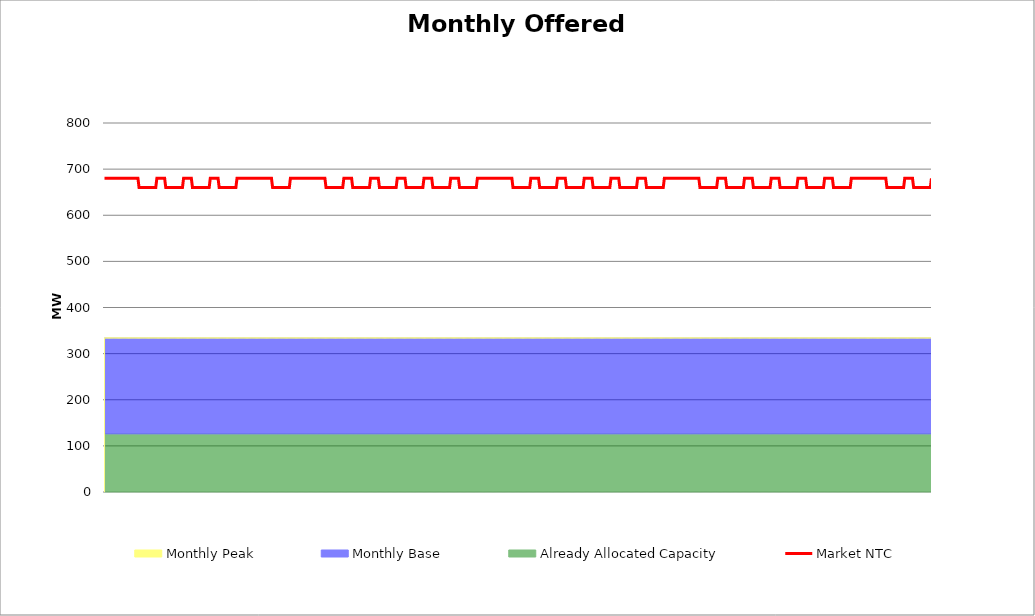
| Category | Market NTC |
|---|---|
| 0 | 680 |
| 1 | 680 |
| 2 | 680 |
| 3 | 680 |
| 4 | 680 |
| 5 | 680 |
| 6 | 680 |
| 7 | 680 |
| 8 | 680 |
| 9 | 680 |
| 10 | 680 |
| 11 | 680 |
| 12 | 680 |
| 13 | 680 |
| 14 | 680 |
| 15 | 680 |
| 16 | 680 |
| 17 | 680 |
| 18 | 680 |
| 19 | 680 |
| 20 | 680 |
| 21 | 680 |
| 22 | 680 |
| 23 | 680 |
| 24 | 680 |
| 25 | 680 |
| 26 | 680 |
| 27 | 680 |
| 28 | 680 |
| 29 | 680 |
| 30 | 680 |
| 31 | 660 |
| 32 | 660 |
| 33 | 660 |
| 34 | 660 |
| 35 | 660 |
| 36 | 660 |
| 37 | 660 |
| 38 | 660 |
| 39 | 660 |
| 40 | 660 |
| 41 | 660 |
| 42 | 660 |
| 43 | 660 |
| 44 | 660 |
| 45 | 660 |
| 46 | 660 |
| 47 | 680 |
| 48 | 680 |
| 49 | 680 |
| 50 | 680 |
| 51 | 680 |
| 52 | 680 |
| 53 | 680 |
| 54 | 680 |
| 55 | 660 |
| 56 | 660 |
| 57 | 660 |
| 58 | 660 |
| 59 | 660 |
| 60 | 660 |
| 61 | 660 |
| 62 | 660 |
| 63 | 660 |
| 64 | 660 |
| 65 | 660 |
| 66 | 660 |
| 67 | 660 |
| 68 | 660 |
| 69 | 660 |
| 70 | 660 |
| 71 | 680 |
| 72 | 680 |
| 73 | 680 |
| 74 | 680 |
| 75 | 680 |
| 76 | 680 |
| 77 | 680 |
| 78 | 680 |
| 79 | 660 |
| 80 | 660 |
| 81 | 660 |
| 82 | 660 |
| 83 | 660 |
| 84 | 660 |
| 85 | 660 |
| 86 | 660 |
| 87 | 660 |
| 88 | 660 |
| 89 | 660 |
| 90 | 660 |
| 91 | 660 |
| 92 | 660 |
| 93 | 660 |
| 94 | 660 |
| 95 | 680 |
| 96 | 680 |
| 97 | 680 |
| 98 | 680 |
| 99 | 680 |
| 100 | 680 |
| 101 | 680 |
| 102 | 680 |
| 103 | 660 |
| 104 | 660 |
| 105 | 660 |
| 106 | 660 |
| 107 | 660 |
| 108 | 660 |
| 109 | 660 |
| 110 | 660 |
| 111 | 660 |
| 112 | 660 |
| 113 | 660 |
| 114 | 660 |
| 115 | 660 |
| 116 | 660 |
| 117 | 660 |
| 118 | 660 |
| 119 | 680 |
| 120 | 680 |
| 121 | 680 |
| 122 | 680 |
| 123 | 680 |
| 124 | 680 |
| 125 | 680 |
| 126 | 680 |
| 127 | 680 |
| 128 | 680 |
| 129 | 680 |
| 130 | 680 |
| 131 | 680 |
| 132 | 680 |
| 133 | 680 |
| 134 | 680 |
| 135 | 680 |
| 136 | 680 |
| 137 | 680 |
| 138 | 680 |
| 139 | 680 |
| 140 | 680 |
| 141 | 680 |
| 142 | 680 |
| 143 | 680 |
| 144 | 680 |
| 145 | 680 |
| 146 | 680 |
| 147 | 680 |
| 148 | 680 |
| 149 | 680 |
| 150 | 680 |
| 151 | 660 |
| 152 | 660 |
| 153 | 660 |
| 154 | 660 |
| 155 | 660 |
| 156 | 660 |
| 157 | 660 |
| 158 | 660 |
| 159 | 660 |
| 160 | 660 |
| 161 | 660 |
| 162 | 660 |
| 163 | 660 |
| 164 | 660 |
| 165 | 660 |
| 166 | 660 |
| 167 | 680 |
| 168 | 680 |
| 169 | 680 |
| 170 | 680 |
| 171 | 680 |
| 172 | 680 |
| 173 | 680 |
| 174 | 680 |
| 175 | 680 |
| 176 | 680 |
| 177 | 680 |
| 178 | 680 |
| 179 | 680 |
| 180 | 680 |
| 181 | 680 |
| 182 | 680 |
| 183 | 680 |
| 184 | 680 |
| 185 | 680 |
| 186 | 680 |
| 187 | 680 |
| 188 | 680 |
| 189 | 680 |
| 190 | 680 |
| 191 | 680 |
| 192 | 680 |
| 193 | 680 |
| 194 | 680 |
| 195 | 680 |
| 196 | 680 |
| 197 | 680 |
| 198 | 680 |
| 199 | 660 |
| 200 | 660 |
| 201 | 660 |
| 202 | 660 |
| 203 | 660 |
| 204 | 660 |
| 205 | 660 |
| 206 | 660 |
| 207 | 660 |
| 208 | 660 |
| 209 | 660 |
| 210 | 660 |
| 211 | 660 |
| 212 | 660 |
| 213 | 660 |
| 214 | 660 |
| 215 | 680 |
| 216 | 680 |
| 217 | 680 |
| 218 | 680 |
| 219 | 680 |
| 220 | 680 |
| 221 | 680 |
| 222 | 680 |
| 223 | 660 |
| 224 | 660 |
| 225 | 660 |
| 226 | 660 |
| 227 | 660 |
| 228 | 660 |
| 229 | 660 |
| 230 | 660 |
| 231 | 660 |
| 232 | 660 |
| 233 | 660 |
| 234 | 660 |
| 235 | 660 |
| 236 | 660 |
| 237 | 660 |
| 238 | 660 |
| 239 | 680 |
| 240 | 680 |
| 241 | 680 |
| 242 | 680 |
| 243 | 680 |
| 244 | 680 |
| 245 | 680 |
| 246 | 680 |
| 247 | 660 |
| 248 | 660 |
| 249 | 660 |
| 250 | 660 |
| 251 | 660 |
| 252 | 660 |
| 253 | 660 |
| 254 | 660 |
| 255 | 660 |
| 256 | 660 |
| 257 | 660 |
| 258 | 660 |
| 259 | 660 |
| 260 | 660 |
| 261 | 660 |
| 262 | 660 |
| 263 | 680 |
| 264 | 680 |
| 265 | 680 |
| 266 | 680 |
| 267 | 680 |
| 268 | 680 |
| 269 | 680 |
| 270 | 680 |
| 271 | 660 |
| 272 | 660 |
| 273 | 660 |
| 274 | 660 |
| 275 | 660 |
| 276 | 660 |
| 277 | 660 |
| 278 | 660 |
| 279 | 660 |
| 280 | 660 |
| 281 | 660 |
| 282 | 660 |
| 283 | 660 |
| 284 | 660 |
| 285 | 660 |
| 286 | 660 |
| 287 | 680 |
| 288 | 680 |
| 289 | 680 |
| 290 | 680 |
| 291 | 680 |
| 292 | 680 |
| 293 | 680 |
| 294 | 680 |
| 295 | 660 |
| 296 | 660 |
| 297 | 660 |
| 298 | 660 |
| 299 | 660 |
| 300 | 660 |
| 301 | 660 |
| 302 | 660 |
| 303 | 660 |
| 304 | 660 |
| 305 | 660 |
| 306 | 660 |
| 307 | 660 |
| 308 | 660 |
| 309 | 660 |
| 310 | 660 |
| 311 | 680 |
| 312 | 680 |
| 313 | 680 |
| 314 | 680 |
| 315 | 680 |
| 316 | 680 |
| 317 | 680 |
| 318 | 680 |
| 319 | 660 |
| 320 | 660 |
| 321 | 660 |
| 322 | 660 |
| 323 | 660 |
| 324 | 660 |
| 325 | 660 |
| 326 | 660 |
| 327 | 660 |
| 328 | 660 |
| 329 | 660 |
| 330 | 660 |
| 331 | 660 |
| 332 | 660 |
| 333 | 660 |
| 334 | 660 |
| 335 | 680 |
| 336 | 680 |
| 337 | 680 |
| 338 | 680 |
| 339 | 680 |
| 340 | 680 |
| 341 | 680 |
| 342 | 680 |
| 343 | 680 |
| 344 | 680 |
| 345 | 680 |
| 346 | 680 |
| 347 | 680 |
| 348 | 680 |
| 349 | 680 |
| 350 | 680 |
| 351 | 680 |
| 352 | 680 |
| 353 | 680 |
| 354 | 680 |
| 355 | 680 |
| 356 | 680 |
| 357 | 680 |
| 358 | 680 |
| 359 | 680 |
| 360 | 680 |
| 361 | 680 |
| 362 | 680 |
| 363 | 680 |
| 364 | 680 |
| 365 | 680 |
| 366 | 680 |
| 367 | 660 |
| 368 | 660 |
| 369 | 660 |
| 370 | 660 |
| 371 | 660 |
| 372 | 660 |
| 373 | 660 |
| 374 | 660 |
| 375 | 660 |
| 376 | 660 |
| 377 | 660 |
| 378 | 660 |
| 379 | 660 |
| 380 | 660 |
| 381 | 660 |
| 382 | 660 |
| 383 | 680 |
| 384 | 680 |
| 385 | 680 |
| 386 | 680 |
| 387 | 680 |
| 388 | 680 |
| 389 | 680 |
| 390 | 680 |
| 391 | 660 |
| 392 | 660 |
| 393 | 660 |
| 394 | 660 |
| 395 | 660 |
| 396 | 660 |
| 397 | 660 |
| 398 | 660 |
| 399 | 660 |
| 400 | 660 |
| 401 | 660 |
| 402 | 660 |
| 403 | 660 |
| 404 | 660 |
| 405 | 660 |
| 406 | 660 |
| 407 | 680 |
| 408 | 680 |
| 409 | 680 |
| 410 | 680 |
| 411 | 680 |
| 412 | 680 |
| 413 | 680 |
| 414 | 680 |
| 415 | 660 |
| 416 | 660 |
| 417 | 660 |
| 418 | 660 |
| 419 | 660 |
| 420 | 660 |
| 421 | 660 |
| 422 | 660 |
| 423 | 660 |
| 424 | 660 |
| 425 | 660 |
| 426 | 660 |
| 427 | 660 |
| 428 | 660 |
| 429 | 660 |
| 430 | 660 |
| 431 | 680 |
| 432 | 680 |
| 433 | 680 |
| 434 | 680 |
| 435 | 680 |
| 436 | 680 |
| 437 | 680 |
| 438 | 680 |
| 439 | 660 |
| 440 | 660 |
| 441 | 660 |
| 442 | 660 |
| 443 | 660 |
| 444 | 660 |
| 445 | 660 |
| 446 | 660 |
| 447 | 660 |
| 448 | 660 |
| 449 | 660 |
| 450 | 660 |
| 451 | 660 |
| 452 | 660 |
| 453 | 660 |
| 454 | 660 |
| 455 | 680 |
| 456 | 680 |
| 457 | 680 |
| 458 | 680 |
| 459 | 680 |
| 460 | 680 |
| 461 | 680 |
| 462 | 680 |
| 463 | 660 |
| 464 | 660 |
| 465 | 660 |
| 466 | 660 |
| 467 | 660 |
| 468 | 660 |
| 469 | 660 |
| 470 | 660 |
| 471 | 660 |
| 472 | 660 |
| 473 | 660 |
| 474 | 660 |
| 475 | 660 |
| 476 | 660 |
| 477 | 660 |
| 478 | 660 |
| 479 | 680 |
| 480 | 680 |
| 481 | 680 |
| 482 | 680 |
| 483 | 680 |
| 484 | 680 |
| 485 | 680 |
| 486 | 680 |
| 487 | 660 |
| 488 | 660 |
| 489 | 660 |
| 490 | 660 |
| 491 | 660 |
| 492 | 660 |
| 493 | 660 |
| 494 | 660 |
| 495 | 660 |
| 496 | 660 |
| 497 | 660 |
| 498 | 660 |
| 499 | 660 |
| 500 | 660 |
| 501 | 660 |
| 502 | 660 |
| 503 | 680 |
| 504 | 680 |
| 505 | 680 |
| 506 | 680 |
| 507 | 680 |
| 508 | 680 |
| 509 | 680 |
| 510 | 680 |
| 511 | 680 |
| 512 | 680 |
| 513 | 680 |
| 514 | 680 |
| 515 | 680 |
| 516 | 680 |
| 517 | 680 |
| 518 | 680 |
| 519 | 680 |
| 520 | 680 |
| 521 | 680 |
| 522 | 680 |
| 523 | 680 |
| 524 | 680 |
| 525 | 680 |
| 526 | 680 |
| 527 | 680 |
| 528 | 680 |
| 529 | 680 |
| 530 | 680 |
| 531 | 680 |
| 532 | 680 |
| 533 | 680 |
| 534 | 680 |
| 535 | 660 |
| 536 | 660 |
| 537 | 660 |
| 538 | 660 |
| 539 | 660 |
| 540 | 660 |
| 541 | 660 |
| 542 | 660 |
| 543 | 660 |
| 544 | 660 |
| 545 | 660 |
| 546 | 660 |
| 547 | 660 |
| 548 | 660 |
| 549 | 660 |
| 550 | 660 |
| 551 | 680 |
| 552 | 680 |
| 553 | 680 |
| 554 | 680 |
| 555 | 680 |
| 556 | 680 |
| 557 | 680 |
| 558 | 680 |
| 559 | 660 |
| 560 | 660 |
| 561 | 660 |
| 562 | 660 |
| 563 | 660 |
| 564 | 660 |
| 565 | 660 |
| 566 | 660 |
| 567 | 660 |
| 568 | 660 |
| 569 | 660 |
| 570 | 660 |
| 571 | 660 |
| 572 | 660 |
| 573 | 660 |
| 574 | 660 |
| 575 | 680 |
| 576 | 680 |
| 577 | 680 |
| 578 | 680 |
| 579 | 680 |
| 580 | 680 |
| 581 | 680 |
| 582 | 680 |
| 583 | 660 |
| 584 | 660 |
| 585 | 660 |
| 586 | 660 |
| 587 | 660 |
| 588 | 660 |
| 589 | 660 |
| 590 | 660 |
| 591 | 660 |
| 592 | 660 |
| 593 | 660 |
| 594 | 660 |
| 595 | 660 |
| 596 | 660 |
| 597 | 660 |
| 598 | 660 |
| 599 | 680 |
| 600 | 680 |
| 601 | 680 |
| 602 | 680 |
| 603 | 680 |
| 604 | 680 |
| 605 | 680 |
| 606 | 680 |
| 607 | 660 |
| 608 | 660 |
| 609 | 660 |
| 610 | 660 |
| 611 | 660 |
| 612 | 660 |
| 613 | 660 |
| 614 | 660 |
| 615 | 660 |
| 616 | 660 |
| 617 | 660 |
| 618 | 660 |
| 619 | 660 |
| 620 | 660 |
| 621 | 660 |
| 622 | 660 |
| 623 | 680 |
| 624 | 680 |
| 625 | 680 |
| 626 | 680 |
| 627 | 680 |
| 628 | 680 |
| 629 | 680 |
| 630 | 680 |
| 631 | 660 |
| 632 | 660 |
| 633 | 660 |
| 634 | 660 |
| 635 | 660 |
| 636 | 660 |
| 637 | 660 |
| 638 | 660 |
| 639 | 660 |
| 640 | 660 |
| 641 | 660 |
| 642 | 660 |
| 643 | 660 |
| 644 | 660 |
| 645 | 660 |
| 646 | 660 |
| 647 | 680 |
| 648 | 680 |
| 649 | 680 |
| 650 | 680 |
| 651 | 680 |
| 652 | 680 |
| 653 | 680 |
| 654 | 680 |
| 655 | 660 |
| 656 | 660 |
| 657 | 660 |
| 658 | 660 |
| 659 | 660 |
| 660 | 660 |
| 661 | 660 |
| 662 | 660 |
| 663 | 660 |
| 664 | 660 |
| 665 | 660 |
| 666 | 660 |
| 667 | 660 |
| 668 | 660 |
| 669 | 660 |
| 670 | 660 |
| 671 | 680 |
| 672 | 680 |
| 673 | 680 |
| 674 | 680 |
| 675 | 680 |
| 676 | 680 |
| 677 | 680 |
| 678 | 680 |
| 679 | 680 |
| 680 | 680 |
| 681 | 680 |
| 682 | 680 |
| 683 | 680 |
| 684 | 680 |
| 685 | 680 |
| 686 | 680 |
| 687 | 680 |
| 688 | 680 |
| 689 | 680 |
| 690 | 680 |
| 691 | 680 |
| 692 | 680 |
| 693 | 680 |
| 694 | 680 |
| 695 | 680 |
| 696 | 680 |
| 697 | 680 |
| 698 | 680 |
| 699 | 680 |
| 700 | 680 |
| 701 | 680 |
| 702 | 680 |
| 703 | 660 |
| 704 | 660 |
| 705 | 660 |
| 706 | 660 |
| 707 | 660 |
| 708 | 660 |
| 709 | 660 |
| 710 | 660 |
| 711 | 660 |
| 712 | 660 |
| 713 | 660 |
| 714 | 660 |
| 715 | 660 |
| 716 | 660 |
| 717 | 660 |
| 718 | 660 |
| 719 | 680 |
| 720 | 680 |
| 721 | 680 |
| 722 | 680 |
| 723 | 680 |
| 724 | 680 |
| 725 | 680 |
| 726 | 680 |
| 727 | 660 |
| 728 | 660 |
| 729 | 660 |
| 730 | 660 |
| 731 | 660 |
| 732 | 660 |
| 733 | 660 |
| 734 | 660 |
| 735 | 660 |
| 736 | 660 |
| 737 | 660 |
| 738 | 660 |
| 739 | 660 |
| 740 | 660 |
| 741 | 660 |
| 742 | 660 |
| 743 | 680 |